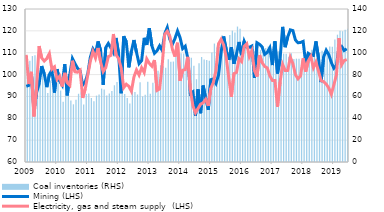
| Category | Coal inventories (RHS) |
|---|---|
| 2009-01-01 | 93.917 |
| 2009-02-01 | 92.739 |
| 2009-03-01 | 96.956 |
| 2009-04-01 | 97.784 |
| 2009-05-01 | 82.654 |
| 2009-06-01 | 75.178 |
| 2009-07-01 | 88.498 |
| 2009-08-01 | 71.701 |
| 2009-09-01 | 63.176 |
| 2009-10-01 | 74.661 |
| 2009-11-01 | 74.445 |
| 2009-12-01 | 66.096 |
| 2010-01-01 | 72.477 |
| 2010-02-01 | 65.362 |
| 2010-03-01 | 55.212 |
| 2010-04-01 | 63.393 |
| 2010-05-01 | 63.963 |
| 2010-06-01 | 56.206 |
| 2010-07-01 | 52.777 |
| 2010-08-01 | 56.865 |
| 2010-09-01 | 62.434 |
| 2010-10-01 | 64.069 |
| 2010-11-01 | 52.66 |
| 2010-12-01 | 62.133 |
| 2011-01-01 | 62.662 |
| 2011-02-01 | 58.584 |
| 2011-03-01 | 55.493 |
| 2011-04-01 | 60.708 |
| 2011-05-01 | 61.786 |
| 2011-06-01 | 67.173 |
| 2011-07-01 | 66.269 |
| 2011-08-01 | 60.737 |
| 2011-09-01 | 62.722 |
| 2011-10-01 | 65.002 |
| 2011-11-01 | 70.207 |
| 2011-12-01 | 73.177 |
| 2012-01-01 | 73.389 |
| 2012-02-01 | 69.422 |
| 2012-03-01 | 62.181 |
| 2012-04-01 | 58.663 |
| 2012-05-01 | 53.522 |
| 2012-06-01 | 68.013 |
| 2012-07-01 | 64.071 |
| 2012-08-01 | 61.795 |
| 2012-09-01 | 73.033 |
| 2012-10-01 | 60.087 |
| 2012-11-01 | 61.555 |
| 2012-12-01 | 73.434 |
| 2013-01-01 | 62.387 |
| 2013-02-01 | 72.444 |
| 2013-03-01 | 88.258 |
| 2013-04-01 | 83.431 |
| 2013-05-01 | 88.584 |
| 2013-06-01 | 87.93 |
| 2013-07-01 | 86.317 |
| 2013-08-01 | 93.92 |
| 2013-09-01 | 91.724 |
| 2013-10-01 | 91.917 |
| 2013-11-01 | 99.824 |
| 2013-12-01 | 95.361 |
| 2014-01-01 | 99.423 |
| 2014-02-01 | 99.191 |
| 2014-03-01 | 94.882 |
| 2014-04-01 | 94.342 |
| 2014-05-01 | 95.478 |
| 2014-06-01 | 88.144 |
| 2014-07-01 | 75.74 |
| 2014-08-01 | 90.369 |
| 2014-09-01 | 96.07 |
| 2014-10-01 | 93.766 |
| 2014-11-01 | 93.325 |
| 2014-12-01 | 92.686 |
| 2015-01-01 | 100.16 |
| 2015-02-01 | 108.381 |
| 2015-03-01 | 105.363 |
| 2015-04-01 | 105.334 |
| 2015-05-01 | 115.947 |
| 2015-06-01 | 109.015 |
| 2015-07-01 | 105.749 |
| 2015-08-01 | 116.279 |
| 2015-09-01 | 120.215 |
| 2015-10-01 | 118.6 |
| 2015-11-01 | 123.924 |
| 2015-12-01 | 121.947 |
| 2016-01-01 | 109.578 |
| 2016-02-01 | 104.285 |
| 2016-03-01 | 103.648 |
| 2016-04-01 | 97.483 |
| 2016-05-01 | 103.65 |
| 2016-06-01 | 101.132 |
| 2016-07-01 | 106.699 |
| 2016-08-01 | 102.372 |
| 2016-09-01 | 106.253 |
| 2016-10-01 | 104.246 |
| 2016-11-01 | 105.8 |
| 2016-12-01 | 103.61 |
| 2017-01-01 | 110.056 |
| 2017-02-01 | 106.19 |
| 2017-03-01 | 101.27 |
| 2017-04-01 | 103.107 |
| 2017-05-01 | 99.153 |
| 2017-06-01 | 98.985 |
| 2017-07-01 | 96.38 |
| 2017-08-01 | 99.499 |
| 2017-09-01 | 94.248 |
| 2017-10-01 | 94.565 |
| 2017-11-01 | 94.379 |
| 2017-12-01 | 93.005 |
| 2018-01-01 | 93.59 |
| 2018-02-01 | 97.992 |
| 2018-03-01 | 98.522 |
| 2018-04-01 | 102.804 |
| 2018-05-01 | 101.087 |
| 2018-06-01 | 103.869 |
| 2018-07-01 | 99.78 |
| 2018-08-01 | 101.791 |
| 2018-09-01 | 101.348 |
| 2018-10-31 | 101.663 |
| 2018-11-30 | 105.586 |
| 2018-12-31 | 105.53 |
| 2019-01-31 | 112.015 |
| 2019-02-28 | 116.496 |
| 2019-03-31 | 120.179 |
| 2019-04-30 | 119.654 |
| 2019-05-31 | 121.104 |
| 2019-06-30 | 121.904 |